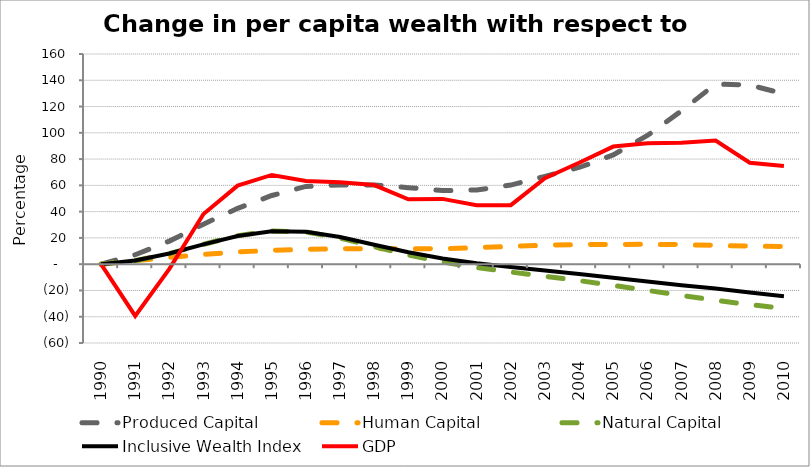
| Category | Produced Capital  | Human Capital | Natural Capital | Inclusive Wealth Index | GDP |
|---|---|---|---|---|---|
| 1990.0 | 0 | 0 | 0 | 0 | 0 |
| 1991.0 | 7.212 | 2.655 | 2.731 | 2.88 | -39.361 |
| 1992.0 | 17.565 | 5.102 | 8.079 | 8.177 | -3.547 |
| 1993.0 | 30.471 | 7.353 | 15.112 | 15.043 | 38.212 |
| 1994.0 | 42.512 | 9.28 | 21.712 | 21.47 | 59.786 |
| 1995.0 | 52.299 | 10.541 | 25.329 | 25.118 | 67.918 |
| 1996.0 | 59.196 | 11.285 | 24.473 | 24.653 | 63.358 |
| 1997.0 | 60.339 | 11.676 | 19.912 | 20.672 | 62.386 |
| 1998.0 | 60.372 | 11.778 | 13.346 | 14.849 | 60.224 |
| 1999.0 | 58.272 | 11.728 | 6.948 | 9.09 | 49.436 |
| 2000.0 | 56.014 | 11.67 | 1.623 | 4.278 | 49.701 |
| 2001.0 | 56.47 | 12.586 | -2.528 | 0.678 | 44.888 |
| 2002.0 | 60.218 | 13.506 | -5.985 | -2.192 | 44.918 |
| 2003.0 | 66.883 | 14.399 | -9.18 | -4.731 | 65.465 |
| 2004.0 | 73.61 | 14.94 | -12.51 | -7.414 | 77.185 |
| 2005.0 | 83.176 | 14.981 | -16.138 | -10.303 | 89.531 |
| 2006.0 | 97.944 | 15.135 | -19.979 | -13.192 | 92.021 |
| 2007.0 | 116.76 | 14.874 | -23.807 | -15.962 | 92.503 |
| 2008.0 | 137.137 | 14.281 | -27.495 | -18.58 | 94.093 |
| 2009.0 | 136.41 | 13.807 | -30.779 | -21.559 | 77.215 |
| 2010.0 | 129.698 | 13.523 | -33.637 | -24.351 | 74.727 |